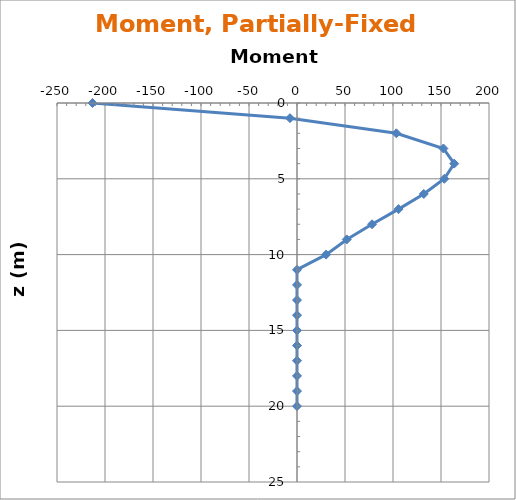
| Category | 0.5 |
|---|---|
| -213.02932595222043 | 0 |
| -7.313987349714017 | 1 |
| 103.48614189714645 | 2 |
| 152.53158774678164 | 3 |
| 163.7388397237198 | 4 |
| 153.44444571055104 | 5 |
| 132.06910673988082 | 6 |
| 105.78177178628248 | 7 |
| 78.1637325582531 | 8 |
| 51.872718290164634 | 9 |
| 30.306990534222937 | 10 |
| 0.0 | 11 |
| 0.0 | 12 |
| 0.0 | 13 |
| 0.0 | 14 |
| 0.0 | 15 |
| 0.0 | 16 |
| 0.0 | 17 |
| 0.0 | 18 |
| 0.0 | 19 |
| 0.0 | 20 |